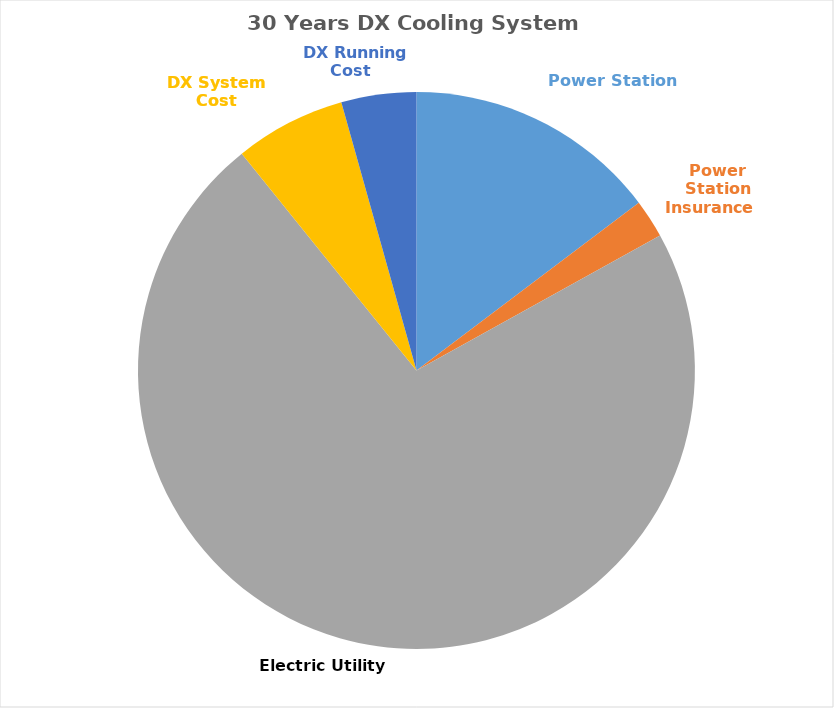
| Category | Series 0 |
|---|---|
| Power Station     | 277888887.341 |
| Power Station Insurance    | 42110951.78 |
| Electric Utility     | 1365142645.203 |
| DX System Cost | 121710155.457 |
|   DX Running Cost | 82189658.091 |